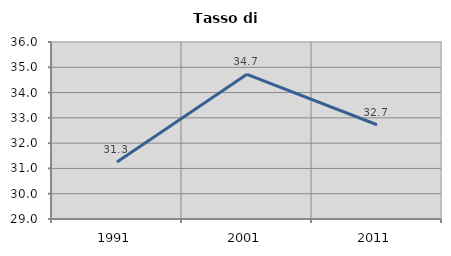
| Category | Tasso di disoccupazione   |
|---|---|
| 1991.0 | 31.25 |
| 2001.0 | 34.722 |
| 2011.0 | 32.727 |